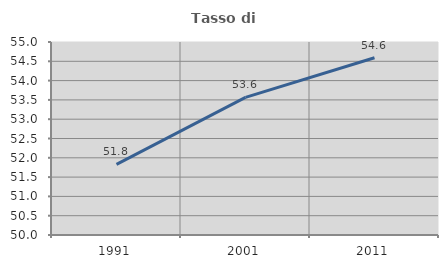
| Category | Tasso di occupazione   |
|---|---|
| 1991.0 | 51.828 |
| 2001.0 | 53.567 |
| 2011.0 | 54.591 |